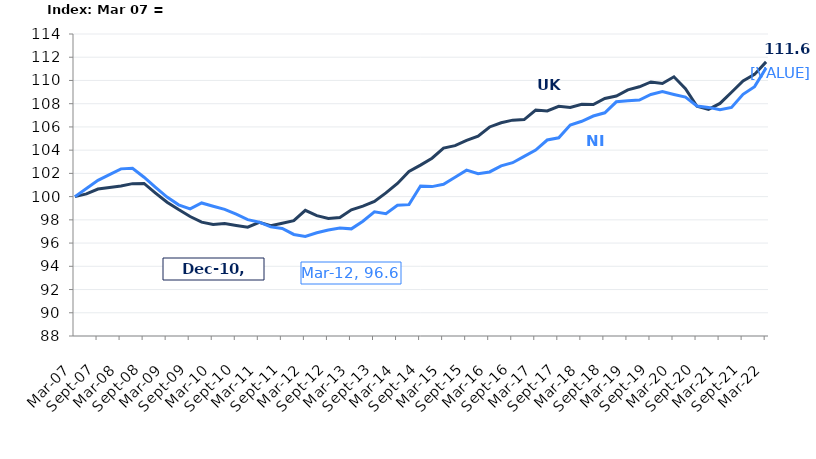
| Category | UK |
|---|---|
| 2007-03-01 | 100 |
| 2007-06-01 | 100.239 |
| 2007-09-01 | 100.656 |
| 2007-12-01 | 100.792 |
| 2008-03-01 | 100.909 |
| 2008-06-01 | 101.116 |
| 2008-09-01 | 101.137 |
| 2008-12-01 | 100.307 |
| 2009-03-01 | 99.511 |
| 2009-06-01 | 98.884 |
| 2009-09-01 | 98.288 |
| 2009-12-01 | 97.8 |
| 2010-03-01 | 97.607 |
| 2010-06-01 | 97.679 |
| 2010-09-01 | 97.522 |
| 2010-12-01 | 97.369 |
| 2011-03-01 | 97.786 |
| 2011-06-01 | 97.497 |
| 2011-09-01 | 97.7 |
| 2011-12-01 | 97.925 |
| 2012-03-01 | 98.823 |
| 2012-06-01 | 98.367 |
| 2012-09-01 | 98.114 |
| 2012-12-01 | 98.203 |
| 2013-03-01 | 98.859 |
| 2013-06-01 | 99.187 |
| 2013-09-01 | 99.586 |
| 2013-12-01 | 100.317 |
| 2014-03-01 | 101.13 |
| 2014-06-01 | 102.161 |
| 2014-09-01 | 102.71 |
| 2014-12-01 | 103.305 |
| 2015-03-01 | 104.172 |
| 2015-06-01 | 104.389 |
| 2015-09-01 | 104.835 |
| 2015-12-01 | 105.209 |
| 2016-03-01 | 105.998 |
| 2016-06-01 | 106.361 |
| 2016-09-01 | 106.582 |
| 2016-12-01 | 106.636 |
| 2017-03-01 | 107.456 |
| 2017-06-01 | 107.381 |
| 2017-09-01 | 107.777 |
| 2017-12-01 | 107.673 |
| 2018-03-01 | 107.952 |
| 2018-06-01 | 107.923 |
| 2018-09-01 | 108.451 |
| 2018-12-01 | 108.665 |
| 2019-03-01 | 109.192 |
| 2019-06-01 | 109.456 |
| 2019-09-01 | 109.873 |
| 2019-12-01 | 109.741 |
| 2020-03-01 | 110.316 |
| 2020-06-01 | 109.299 |
| 2020-09-01 | 107.78 |
| 2020-12-01 | 107.513 |
| 2021-03-01 | 108.023 |
| 2021-06-01 | 108.982 |
| 2021-09-01 | 109.959 |
| 2021-12-01 | 110.522 |
| 2022-03-01 | 111.599 |